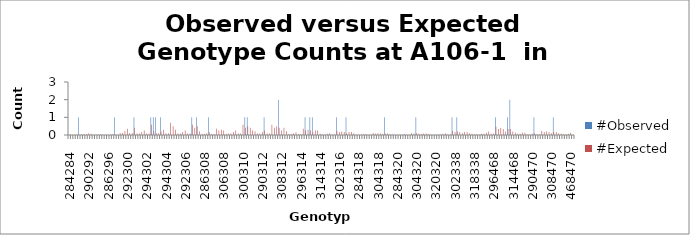
| Category | #Observed | #Expected |
|---|---|---|
| 284284.0 | 0 | 0.008 |
| 284286.0 | 0 | 0.017 |
| 286286.0 | 0 | 0.008 |
| 284290.0 | 0 | 0.033 |
| 286290.0 | 1 | 0.033 |
| 290290.0 | 0 | 0.033 |
| 284292.0 | 0 | 0.05 |
| 286292.0 | 0 | 0.05 |
| 290292.0 | 0 | 0.1 |
| 292292.0 | 0 | 0.075 |
| 284294.0 | 0 | 0.017 |
| 286294.0 | 0 | 0.017 |
| 290294.0 | 0 | 0.033 |
| 292294.0 | 0 | 0.05 |
| 294294.0 | 0 | 0.008 |
| 284296.0 | 0 | 0.017 |
| 286296.0 | 0 | 0.017 |
| 290296.0 | 0 | 0.033 |
| 292296.0 | 0 | 0.05 |
| 294296.0 | 1 | 0.017 |
| 296296.0 | 0 | 0.008 |
| 284300.0 | 0 | 0.117 |
| 286300.0 | 0 | 0.117 |
| 290300.0 | 0 | 0.233 |
| 292300.0 | 0 | 0.35 |
| 294300.0 | 0 | 0.117 |
| 296300.0 | 0 | 0.117 |
| 300300.0 | 1 | 0.408 |
| 284302.0 | 0 | 0.083 |
| 286302.0 | 0 | 0.083 |
| 290302.0 | 0 | 0.167 |
| 292302.0 | 0 | 0.25 |
| 294302.0 | 0 | 0.083 |
| 296302.0 | 0 | 0.083 |
| 300302.0 | 1 | 0.583 |
| 302302.0 | 1 | 0.208 |
| 284304.0 | 1 | 0.1 |
| 286304.0 | 0 | 0.1 |
| 290304.0 | 1 | 0.2 |
| 292304.0 | 0 | 0.3 |
| 294304.0 | 0 | 0.1 |
| 296304.0 | 0 | 0.1 |
| 300304.0 | 0 | 0.7 |
| 302304.0 | 0 | 0.5 |
| 304304.0 | 0 | 0.3 |
| 284306.0 | 0 | 0.083 |
| 286306.0 | 0 | 0.083 |
| 290306.0 | 0 | 0.167 |
| 292306.0 | 0 | 0.25 |
| 294306.0 | 0 | 0.083 |
| 296306.0 | 0 | 0.083 |
| 300306.0 | 1 | 0.583 |
| 302306.0 | 0 | 0.417 |
| 304306.0 | 1 | 0.5 |
| 306306.0 | 0 | 0.208 |
| 284308.0 | 0 | 0.05 |
| 286308.0 | 0 | 0.05 |
| 290308.0 | 0 | 0.1 |
| 292308.0 | 1 | 0.15 |
| 294308.0 | 0 | 0.05 |
| 296308.0 | 0 | 0.05 |
| 300308.0 | 0 | 0.35 |
| 302308.0 | 0 | 0.25 |
| 304308.0 | 0 | 0.3 |
| 306308.0 | 0 | 0.25 |
| 308308.0 | 0 | 0.075 |
| 284310.0 | 0 | 0.083 |
| 286310.0 | 0 | 0.083 |
| 290310.0 | 0 | 0.167 |
| 292310.0 | 0 | 0.25 |
| 294310.0 | 0 | 0.083 |
| 296310.0 | 0 | 0.083 |
| 300310.0 | 0 | 0.583 |
| 302310.0 | 1 | 0.417 |
| 304310.0 | 1 | 0.5 |
| 306310.0 | 0 | 0.417 |
| 308310.0 | 0 | 0.25 |
| 310310.0 | 0 | 0.208 |
| 284312.0 | 0 | 0.083 |
| 286312.0 | 0 | 0.083 |
| 290312.0 | 0 | 0.167 |
| 292312.0 | 1 | 0.25 |
| 294312.0 | 0 | 0.083 |
| 296312.0 | 0 | 0.083 |
| 300312.0 | 0 | 0.583 |
| 302312.0 | 0 | 0.417 |
| 304312.0 | 0 | 0.5 |
| 306312.0 | 2 | 0.417 |
| 308312.0 | 0 | 0.25 |
| 310312.0 | 0 | 0.417 |
| 312312.0 | 0 | 0.208 |
| 284314.0 | 0 | 0.05 |
| 286314.0 | 0 | 0.05 |
| 290314.0 | 0 | 0.1 |
| 292314.0 | 0 | 0.15 |
| 294314.0 | 0 | 0.05 |
| 296314.0 | 0 | 0.05 |
| 300314.0 | 0 | 0.35 |
| 302314.0 | 1 | 0.25 |
| 304314.0 | 0 | 0.3 |
| 306314.0 | 1 | 0.25 |
| 308314.0 | 1 | 0.15 |
| 310314.0 | 0 | 0.25 |
| 312314.0 | 0 | 0.25 |
| 314314.0 | 0 | 0.075 |
| 284316.0 | 0 | 0.033 |
| 286316.0 | 0 | 0.033 |
| 290316.0 | 0 | 0.067 |
| 292316.0 | 0 | 0.1 |
| 294316.0 | 0 | 0.033 |
| 296316.0 | 0 | 0.033 |
| 300316.0 | 1 | 0.233 |
| 302316.0 | 0 | 0.167 |
| 304316.0 | 0 | 0.2 |
| 306316.0 | 0 | 0.167 |
| 308316.0 | 1 | 0.1 |
| 310316.0 | 0 | 0.167 |
| 312316.0 | 0 | 0.167 |
| 314316.0 | 0 | 0.1 |
| 316316.0 | 0 | 0.033 |
| 284318.0 | 0 | 0.017 |
| 286318.0 | 0 | 0.017 |
| 290318.0 | 0 | 0.033 |
| 292318.0 | 0 | 0.05 |
| 294318.0 | 0 | 0.017 |
| 296318.0 | 0 | 0.017 |
| 300318.0 | 0 | 0.117 |
| 302318.0 | 0 | 0.083 |
| 304318.0 | 0 | 0.1 |
| 306318.0 | 0 | 0.083 |
| 308318.0 | 0 | 0.05 |
| 310318.0 | 1 | 0.083 |
| 312318.0 | 0 | 0.083 |
| 314318.0 | 0 | 0.05 |
| 316318.0 | 0 | 0.033 |
| 318318.0 | 0 | 0.008 |
| 284320.0 | 0 | 0.017 |
| 286320.0 | 0 | 0.017 |
| 290320.0 | 0 | 0.033 |
| 292320.0 | 0 | 0.05 |
| 294320.0 | 0 | 0.017 |
| 296320.0 | 0 | 0.017 |
| 300320.0 | 0 | 0.117 |
| 302320.0 | 0 | 0.083 |
| 304320.0 | 1 | 0.1 |
| 306320.0 | 0 | 0.083 |
| 308320.0 | 0 | 0.05 |
| 310320.0 | 0 | 0.083 |
| 312320.0 | 0 | 0.083 |
| 314320.0 | 0 | 0.05 |
| 316320.0 | 0 | 0.033 |
| 318320.0 | 0 | 0.017 |
| 320320.0 | 0 | 0.008 |
| 284338.0 | 0 | 0.033 |
| 286338.0 | 0 | 0.033 |
| 290338.0 | 0 | 0.067 |
| 292338.0 | 0 | 0.1 |
| 294338.0 | 0 | 0.033 |
| 296338.0 | 0 | 0.033 |
| 300338.0 | 1 | 0.233 |
| 302338.0 | 0 | 0.167 |
| 304338.0 | 1 | 0.2 |
| 306338.0 | 0 | 0.167 |
| 308338.0 | 0 | 0.1 |
| 310338.0 | 0 | 0.167 |
| 312338.0 | 0 | 0.167 |
| 314338.0 | 0 | 0.1 |
| 316338.0 | 0 | 0.067 |
| 318338.0 | 0 | 0.033 |
| 320338.0 | 0 | 0.033 |
| 338338.0 | 0 | 0.033 |
| 284468.0 | 0 | 0.067 |
| 286468.0 | 0 | 0.067 |
| 290468.0 | 0 | 0.133 |
| 292468.0 | 0 | 0.2 |
| 294468.0 | 0 | 0.067 |
| 296468.0 | 0 | 0.067 |
| 300468.0 | 1 | 0.467 |
| 302468.0 | 0 | 0.333 |
| 304468.0 | 0 | 0.4 |
| 306468.0 | 0 | 0.333 |
| 308468.0 | 0 | 0.2 |
| 310468.0 | 1 | 0.333 |
| 312468.0 | 2 | 0.333 |
| 314468.0 | 0 | 0.2 |
| 316468.0 | 0 | 0.133 |
| 318468.0 | 0 | 0.067 |
| 320468.0 | 0 | 0.067 |
| 338468.0 | 0 | 0.133 |
| 468468.0 | 0 | 0.133 |
| 284470.0 | 0 | 0.033 |
| 286470.0 | 0 | 0.033 |
| 290470.0 | 0 | 0.067 |
| 292470.0 | 1 | 0.1 |
| 294470.0 | 0 | 0.033 |
| 296470.0 | 0 | 0.033 |
| 300470.0 | 0 | 0.233 |
| 302470.0 | 0 | 0.167 |
| 304470.0 | 0 | 0.2 |
| 306470.0 | 0 | 0.167 |
| 308470.0 | 0 | 0.1 |
| 310470.0 | 1 | 0.167 |
| 312470.0 | 0 | 0.167 |
| 314470.0 | 0 | 0.1 |
| 316470.0 | 0 | 0.067 |
| 318470.0 | 0 | 0.033 |
| 320470.0 | 0 | 0.033 |
| 338470.0 | 0 | 0.067 |
| 468470.0 | 0 | 0.133 |
| 470470.0 | 0 | 0.033 |